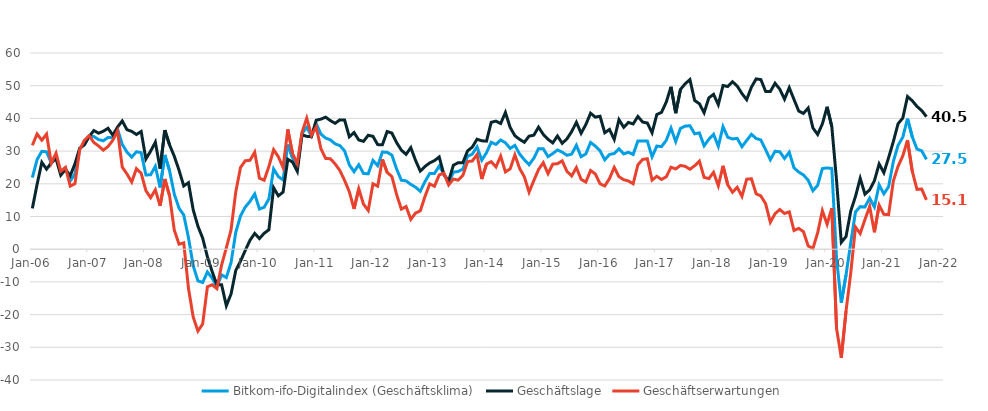
| Category | Bitkom-ifo-Digitalindex (Geschäftsklima) | Geschäftslage | Geschäftserwartungen |
|---|---|---|---|
| 2006-01-01 | 21.92 | 12.48 | 31.78 |
| 2006-02-01 | 27.42 | 19.85 | 35.24 |
| 2006-03-01 | 29.93 | 26.57 | 33.33 |
| 2006-04-01 | 29.78 | 24.49 | 35.2 |
| 2006-05-01 | 26.36 | 26.4 | 26.32 |
| 2006-06-01 | 28.54 | 27.72 | 29.36 |
| 2006-07-01 | 23.23 | 22.63 | 23.83 |
| 2006-08-01 | 24.73 | 24.43 | 25.03 |
| 2006-09-01 | 20.88 | 22.47 | 19.31 |
| 2006-10-01 | 23.04 | 26.11 | 20.01 |
| 2006-11-01 | 30.6 | 30.84 | 30.37 |
| 2006-12-01 | 32.61 | 31.9 | 33.32 |
| 2007-01-01 | 34.57 | 34.45 | 34.7 |
| 2007-02-01 | 34.45 | 36.29 | 32.63 |
| 2007-03-01 | 33.51 | 35.47 | 31.56 |
| 2007-04-01 | 33.16 | 36.08 | 30.28 |
| 2007-05-01 | 34.18 | 36.98 | 31.4 |
| 2007-06-01 | 34.08 | 34.87 | 33.3 |
| 2007-07-01 | 36.77 | 37.34 | 36.21 |
| 2007-08-01 | 32.07 | 39.22 | 25.12 |
| 2007-09-01 | 29.67 | 36.54 | 23 |
| 2007-10-01 | 28.16 | 36.04 | 20.54 |
| 2007-11-01 | 29.8 | 35.08 | 24.64 |
| 2007-12-01 | 29.52 | 35.99 | 23.22 |
| 2008-01-01 | 22.71 | 27.6 | 17.91 |
| 2008-02-01 | 22.75 | 29.98 | 15.75 |
| 2008-03-01 | 25.34 | 32.74 | 18.17 |
| 2008-04-01 | 18.87 | 24.65 | 13.24 |
| 2008-05-01 | 28.83 | 36.43 | 21.47 |
| 2008-06-01 | 24.02 | 31.91 | 16.39 |
| 2008-07-01 | 16.84 | 28.42 | 5.84 |
| 2008-08-01 | 12.55 | 24.17 | 1.53 |
| 2008-09-01 | 10.47 | 19.35 | 1.94 |
| 2008-10-01 | 3.53 | 20.33 | -11.98 |
| 2008-11-01 | -5.05 | 12.04 | -20.76 |
| 2008-12-01 | -9.68 | 7.03 | -25.03 |
| 2009-01-01 | -10.18 | 3.39 | -22.85 |
| 2009-02-01 | -6.96 | -2.32 | -11.49 |
| 2009-03-01 | -8.86 | -6.81 | -10.89 |
| 2009-04-01 | -11.45 | -10.86 | -12.05 |
| 2009-05-01 | -7.86 | -10.84 | -4.85 |
| 2009-06-01 | -8.66 | -17.3 | 0.39 |
| 2009-07-01 | -4.13 | -13.7 | 5.92 |
| 2009-08-01 | 5.18 | -6.49 | 17.55 |
| 2009-09-01 | 10.17 | -3.67 | 24.98 |
| 2009-10-01 | 12.89 | -0.4 | 27.05 |
| 2009-11-01 | 14.61 | 2.73 | 27.18 |
| 2009-12-01 | 16.89 | 4.83 | 29.66 |
| 2010-01-01 | 12.29 | 3.26 | 21.72 |
| 2010-02-01 | 12.82 | 4.87 | 21.09 |
| 2010-03-01 | 15.4 | 5.93 | 25.3 |
| 2010-04-01 | 24.54 | 18.8 | 30.43 |
| 2010-05-01 | 22.21 | 16.32 | 28.27 |
| 2010-06-01 | 21.18 | 17.45 | 24.98 |
| 2010-07-01 | 32.02 | 27.5 | 36.64 |
| 2010-08-01 | 27.93 | 26.64 | 29.23 |
| 2010-09-01 | 25.01 | 23.82 | 26.2 |
| 2010-10-01 | 35.34 | 34.97 | 35.72 |
| 2010-11-01 | 37.27 | 34.51 | 40.07 |
| 2010-12-01 | 34.62 | 34.41 | 34.83 |
| 2011-01-01 | 38.4 | 39.44 | 37.37 |
| 2011-02-01 | 35.2 | 39.78 | 30.71 |
| 2011-03-01 | 33.99 | 40.38 | 27.76 |
| 2011-04-01 | 33.42 | 39.32 | 27.66 |
| 2011-05-01 | 32.21 | 38.5 | 26.08 |
| 2011-06-01 | 31.69 | 39.55 | 24.09 |
| 2011-07-01 | 30.08 | 39.51 | 21.02 |
| 2011-08-01 | 25.82 | 34.37 | 17.58 |
| 2011-09-01 | 23.69 | 35.67 | 12.31 |
| 2011-10-01 | 25.82 | 33.4 | 18.47 |
| 2011-11-01 | 23.16 | 32.98 | 13.75 |
| 2011-12-01 | 23.05 | 34.84 | 11.86 |
| 2012-01-01 | 27.14 | 34.51 | 20 |
| 2012-02-01 | 25.55 | 31.98 | 19.29 |
| 2012-03-01 | 29.71 | 31.97 | 27.48 |
| 2012-04-01 | 29.65 | 35.99 | 23.48 |
| 2012-05-01 | 28.77 | 35.51 | 22.22 |
| 2012-06-01 | 24.52 | 32.6 | 16.72 |
| 2012-07-01 | 21.09 | 30.3 | 12.25 |
| 2012-08-01 | 20.89 | 29.01 | 13.05 |
| 2012-09-01 | 19.82 | 31.06 | 9.13 |
| 2012-10-01 | 18.96 | 27.17 | 11.05 |
| 2012-11-01 | 17.72 | 23.88 | 11.72 |
| 2012-12-01 | 20.67 | 25.31 | 16.13 |
| 2013-01-01 | 23.17 | 26.4 | 19.98 |
| 2013-02-01 | 23.13 | 27.08 | 19.25 |
| 2013-03-01 | 25.44 | 28.21 | 22.71 |
| 2013-04-01 | 23.02 | 22.77 | 23.27 |
| 2013-05-01 | 20.27 | 20.9 | 19.65 |
| 2013-06-01 | 23.56 | 25.68 | 21.46 |
| 2013-07-01 | 23.76 | 26.43 | 21.12 |
| 2013-08-01 | 24.49 | 26.45 | 22.56 |
| 2013-09-01 | 28.42 | 30.07 | 26.79 |
| 2013-10-01 | 29.09 | 31.23 | 26.98 |
| 2013-11-01 | 31.27 | 33.64 | 28.92 |
| 2013-12-01 | 27.22 | 33.15 | 21.44 |
| 2014-01-01 | 29.52 | 33.05 | 26.03 |
| 2014-02-01 | 32.7 | 38.81 | 26.76 |
| 2014-03-01 | 32.05 | 39.17 | 25.15 |
| 2014-04-01 | 33.4 | 38.44 | 28.46 |
| 2014-05-01 | 32.54 | 41.81 | 23.63 |
| 2014-06-01 | 30.82 | 37.25 | 24.57 |
| 2014-07-01 | 31.75 | 34.7 | 28.84 |
| 2014-08-01 | 29.1 | 33.59 | 24.69 |
| 2014-09-01 | 27.36 | 32.7 | 22.14 |
| 2014-10-01 | 25.84 | 34.58 | 17.43 |
| 2014-11-01 | 27.82 | 34.86 | 20.98 |
| 2014-12-01 | 30.75 | 37.33 | 24.35 |
| 2015-01-01 | 30.73 | 35.11 | 26.45 |
| 2015-02-01 | 28.3 | 33.61 | 23.12 |
| 2015-03-01 | 29.24 | 32.51 | 26.02 |
| 2015-04-01 | 30.34 | 34.62 | 26.14 |
| 2015-05-01 | 29.68 | 32.39 | 27.01 |
| 2015-06-01 | 28.72 | 33.73 | 23.82 |
| 2015-07-01 | 29.07 | 35.95 | 22.39 |
| 2015-08-01 | 31.77 | 38.8 | 24.95 |
| 2015-09-01 | 28.29 | 35.45 | 21.36 |
| 2015-10-01 | 29.15 | 38.11 | 20.53 |
| 2015-11-01 | 32.65 | 41.58 | 24.06 |
| 2015-12-01 | 31.54 | 40.39 | 23.02 |
| 2016-01-01 | 30.11 | 40.66 | 20.02 |
| 2016-02-01 | 27.33 | 35.61 | 19.34 |
| 2016-03-01 | 28.98 | 36.61 | 21.6 |
| 2016-04-01 | 29.26 | 33.58 | 25.01 |
| 2016-05-01 | 30.72 | 39.62 | 22.16 |
| 2016-06-01 | 29.14 | 37.3 | 21.26 |
| 2016-07-01 | 29.64 | 38.76 | 20.86 |
| 2016-08-01 | 28.97 | 38.3 | 20.02 |
| 2016-09-01 | 33.07 | 40.59 | 25.79 |
| 2016-10-01 | 33.1 | 38.89 | 27.45 |
| 2016-11-01 | 33.06 | 38.58 | 27.66 |
| 2016-12-01 | 28.25 | 35.6 | 21.13 |
| 2017-01-01 | 31.54 | 41.17 | 22.29 |
| 2017-02-01 | 31.37 | 41.87 | 21.32 |
| 2017-03-01 | 33.29 | 44.99 | 22.15 |
| 2017-04-01 | 37.04 | 49.66 | 25.06 |
| 2017-05-01 | 32.92 | 41.6 | 24.55 |
| 2017-06-01 | 36.95 | 48.86 | 25.61 |
| 2017-07-01 | 37.64 | 50.59 | 25.35 |
| 2017-08-01 | 37.76 | 51.87 | 24.45 |
| 2017-09-01 | 35.29 | 45.48 | 25.52 |
| 2017-10-01 | 35.56 | 44.49 | 26.95 |
| 2017-11-01 | 31.64 | 41.73 | 21.97 |
| 2017-12-01 | 33.61 | 46.28 | 21.59 |
| 2018-01-01 | 35.13 | 47.36 | 23.5 |
| 2018-02-01 | 31.47 | 44.21 | 19.4 |
| 2018-03-01 | 37.47 | 50.06 | 25.51 |
| 2018-04-01 | 34.23 | 49.75 | 19.68 |
| 2018-05-01 | 33.71 | 51.22 | 17.42 |
| 2018-06-01 | 33.89 | 49.89 | 18.92 |
| 2018-07-01 | 31.34 | 47.59 | 16.15 |
| 2018-08-01 | 33.25 | 45.73 | 21.41 |
| 2018-09-01 | 35.13 | 49.55 | 21.54 |
| 2018-10-01 | 33.86 | 52.08 | 16.95 |
| 2018-11-01 | 33.4 | 51.87 | 16.27 |
| 2018-12-01 | 30.45 | 48.26 | 13.91 |
| 2019-01-01 | 27.36 | 48.22 | 8.25 |
| 2019-02-01 | 29.94 | 50.75 | 10.86 |
| 2019-03-01 | 29.79 | 48.92 | 12.13 |
| 2019-04-01 | 27.74 | 45.89 | 10.92 |
| 2019-05-01 | 29.64 | 49.41 | 11.43 |
| 2019-06-01 | 24.87 | 45.8 | 5.72 |
| 2019-07-01 | 23.6 | 42.26 | 6.37 |
| 2019-08-01 | 22.71 | 41.54 | 5.35 |
| 2019-09-01 | 21.08 | 43.17 | 1 |
| 2019-10-01 | 17.87 | 37.09 | 0.22 |
| 2019-11-01 | 19.53 | 35.09 | 5 |
| 2019-12-01 | 24.65 | 38.31 | 11.77 |
| 2020-01-01 | 24.86 | 43.55 | 7.61 |
| 2020-02-01 | 24.67 | 37.44 | 12.59 |
| 2020-03-01 | -2.93 | 20.98 | -24.25 |
| 2020-04-01 | -16.41 | 2.09 | -33.21 |
| 2020-05-01 | -7.87 | 3.86 | -18.92 |
| 2020-06-01 | 1.99 | 11.67 | -7.24 |
| 2020-07-01 | 11.38 | 16.12 | 6.75 |
| 2020-08-01 | 13.06 | 21.67 | 4.79 |
| 2020-09-01 | 12.93 | 16.84 | 9.09 |
| 2020-10-01 | 15.6 | 18.15 | 13.09 |
| 2020-11-01 | 12.9 | 20.94 | 5.16 |
| 2020-12-01 | 19.67 | 26.07 | 13.46 |
| 2021-01-01 | 16.93 | 23.39 | 10.66 |
| 2021-02-01 | 19.1 | 27.99 | 10.56 |
| 2021-03-01 | 26.8 | 32.91 | 20.85 |
| 2021-04-01 | 31.77 | 38.36 | 25.35 |
| 2021-05-01 | 34.25 | 40.11 | 28.53 |
| 2021-06-01 | 39.92 | 46.68 | 33.34 |
| 2021-07-01 | 34.38 | 45.4 | 23.85 |
| 2021-08-01 | 30.63 | 43.66 | 18.3 |
| 2021-09-01 | 30.08 | 42.39 | 18.39 |
| 2021-10-01 | 27.46 | 40.53 | 15.1 |